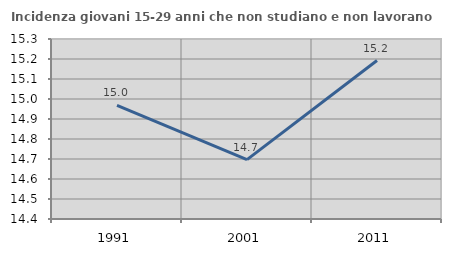
| Category | Incidenza giovani 15-29 anni che non studiano e non lavorano  |
|---|---|
| 1991.0 | 14.968 |
| 2001.0 | 14.697 |
| 2011.0 | 15.192 |